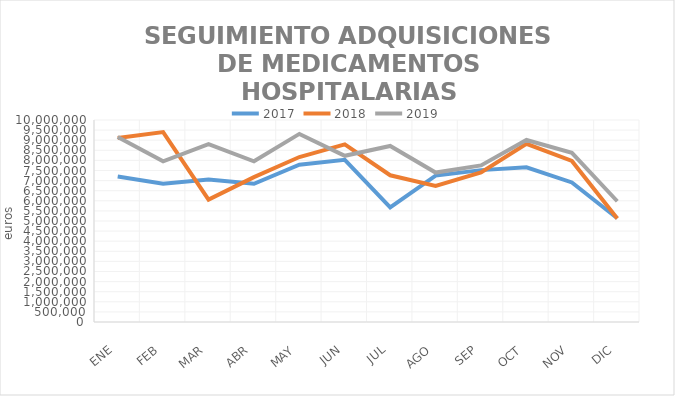
| Category | 2017 | 2018 | 2019 |
|---|---|---|---|
| ENE | 7202161.91 | 9110464.58 | 9161692.65 |
| FEB | 6846366.04 | 9400990.7 | 7952443.12 |
| MAR | 7052781.59 | 6057896.53 | 8801925.47 |
| ABR | 6841947.79 | 7172342.89 | 7956835.8 |
| MAY | 7783862.16 | 8166593.31 | 9311718.98 |
| JUN | 8029256.63 | 8796197.85 | 8227059.31 |
| JUL | 5672189.99 | 7264171.46 | 8716164.31 |
| AGO | 7249864.26 | 6740366.88 | 7396082.32 |
| SEP | 7518880.73 | 7405198.91 | 7752908.77 |
| OCT | 7655520.38 | 8822004.41 | 9010137.59 |
| NOV | 6907519.6 | 7973323.7 | 8372830.72 |
| DIC | 5136376.59 | 5125164.45 | 5977615.26 |